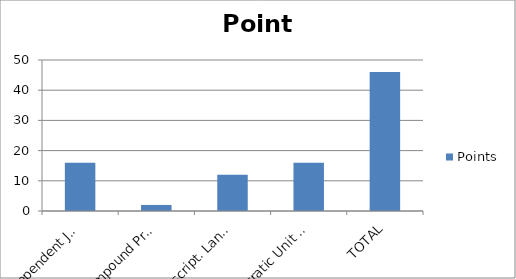
| Category | Points |
|---|---|
| Independent Journal | 16 |
| Compound Predicate Wkst | 2 |
| Descript. Lang. Co-Op Act.  | 12 |
| Socratic Unit Review | 16 |
| TOTAL | 46 |